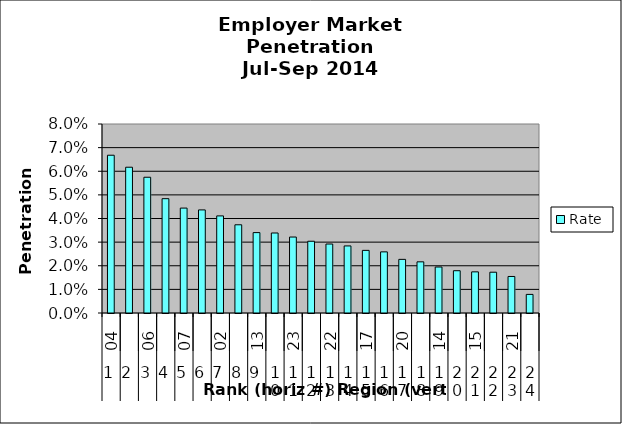
| Category | Rate |
|---|---|
| 0 | 0.067 |
| 1 | 0.062 |
| 2 | 0.057 |
| 3 | 0.048 |
| 4 | 0.044 |
| 5 | 0.044 |
| 6 | 0.041 |
| 7 | 0.037 |
| 8 | 0.034 |
| 9 | 0.034 |
| 10 | 0.032 |
| 11 | 0.03 |
| 12 | 0.029 |
| 13 | 0.028 |
| 14 | 0.027 |
| 15 | 0.026 |
| 16 | 0.023 |
| 17 | 0.022 |
| 18 | 0.019 |
| 19 | 0.018 |
| 20 | 0.017 |
| 21 | 0.017 |
| 22 | 0.015 |
| 23 | 0.008 |